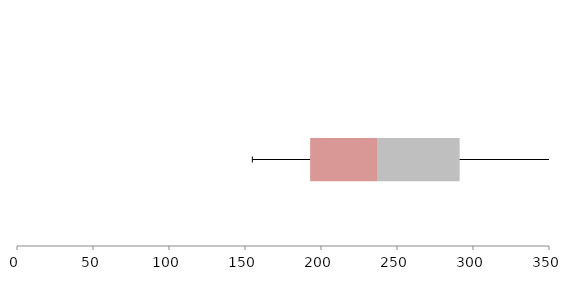
| Category | Series 1 | Series 2 | Series 3 |
|---|---|---|---|
| 0 | 192.853 | 43.999 | 54.354 |